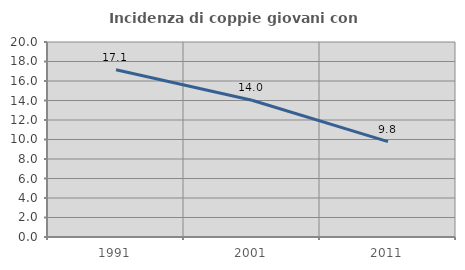
| Category | Incidenza di coppie giovani con figli |
|---|---|
| 1991.0 | 17.146 |
| 2001.0 | 14.025 |
| 2011.0 | 9.788 |